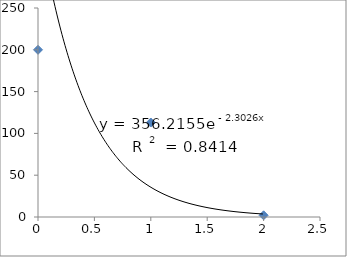
| Category | Series 0 |
|---|---|
| 0.0 | 200 |
| 1.0 | 113 |
| 2.0 | 2 |